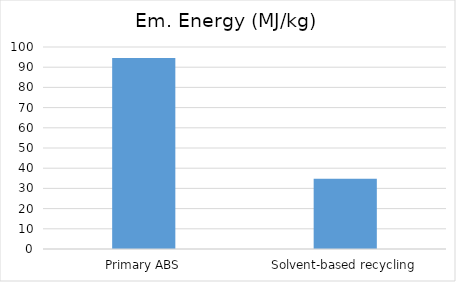
| Category | Em. Energy (MJ/kg) |
|---|---|
| Primary ABS | 94.5 |
| Solvent-based recycling | 34.8 |